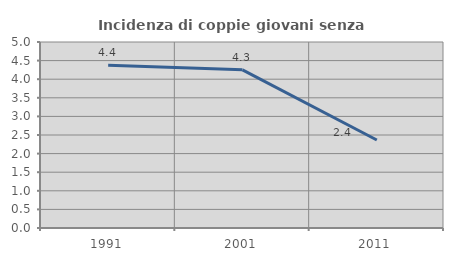
| Category | Incidenza di coppie giovani senza figli |
|---|---|
| 1991.0 | 4.374 |
| 2001.0 | 4.253 |
| 2011.0 | 2.366 |